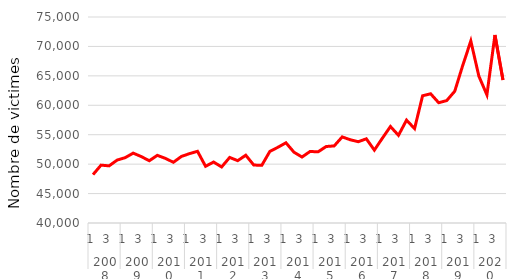
| Category | Série CVS-CJO |
|---|---|
| 0 | 48222.376 |
| 1 | 49830.257 |
| 2 | 49708.166 |
| 3 | 50690.24 |
| 4 | 51099.45 |
| 5 | 51872.611 |
| 6 | 51286.901 |
| 7 | 50579.395 |
| 8 | 51493.445 |
| 9 | 50980.531 |
| 10 | 50315.192 |
| 11 | 51311.819 |
| 12 | 51783.123 |
| 13 | 52182.718 |
| 14 | 49635.499 |
| 15 | 50356.492 |
| 16 | 49521.87 |
| 17 | 51139.326 |
| 18 | 50589.828 |
| 19 | 51515.443 |
| 20 | 49842.963 |
| 21 | 49810.473 |
| 22 | 52168.623 |
| 23 | 52863.006 |
| 24 | 53626.71 |
| 25 | 52024.828 |
| 26 | 51210.808 |
| 27 | 52154.24 |
| 28 | 52090.335 |
| 29 | 52994.678 |
| 30 | 53095.661 |
| 31 | 54627.09 |
| 32 | 54142.968 |
| 33 | 53812.308 |
| 34 | 54302.77 |
| 35 | 52384.383 |
| 36 | 54413.574 |
| 37 | 56391.948 |
| 38 | 54897.077 |
| 39 | 57478.734 |
| 40 | 56036.772 |
| 41 | 61617.442 |
| 42 | 61953.37 |
| 43 | 60435.685 |
| 44 | 60798.705 |
| 45 | 62389.007 |
| 46 | 66804.55 |
| 47 | 70925.496 |
| 48 | 64949.471 |
| 49 | 61776.009 |
| 50 | 71948.71 |
| 51 | 64305.334 |